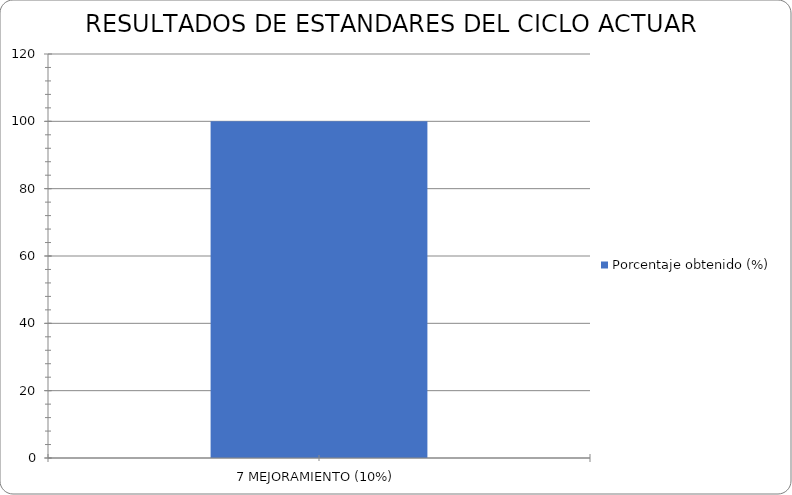
| Category | Porcentaje obtenido (%) |
|---|---|
| 7 MEJORAMIENTO (10%) | 100 |